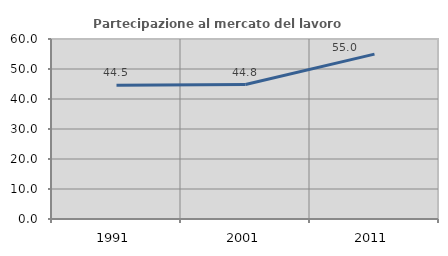
| Category | Partecipazione al mercato del lavoro  femminile |
|---|---|
| 1991.0 | 44.543 |
| 2001.0 | 44.808 |
| 2011.0 | 54.96 |